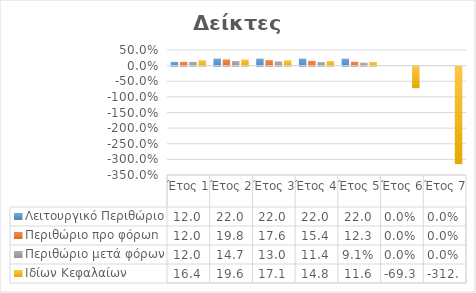
| Category | Λειτουργικό Περιθώριo | Περιθώριο προ φόρωn | Περιθώριο μετά φόρων | Ιδίων Κεφαλαίων |
|---|---|---|---|---|
| Έτος 1 | 0.12 | 0.12 | 0.12 | 0.164 |
| Έτος 2 | 0.22 | 0.198 | 0.147 | 0.196 |
| Έτος 3 | 0.22 | 0.176 | 0.13 | 0.171 |
| Έτος 4 | 0.22 | 0.154 | 0.114 | 0.148 |
| Έτος 5 | 0.22 | 0.123 | 0.091 | 0.116 |
| Έτος 6 | 0 | 0 | 0 | -0.693 |
| Έτος 7 | 0 | 0 | 0 | -3.122 |